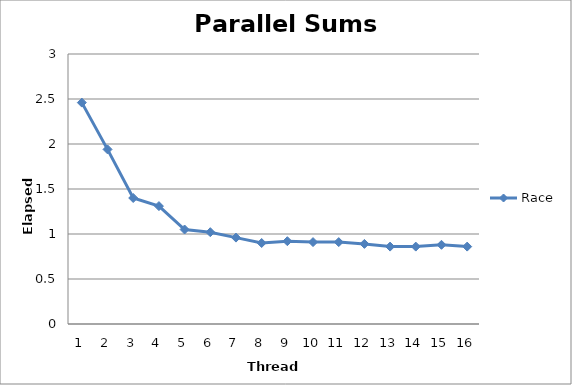
| Category | Race |
|---|---|
| 0 | 2.46 |
| 1 | 1.94 |
| 2 | 1.4 |
| 3 | 1.31 |
| 4 | 1.05 |
| 5 | 1.02 |
| 6 | 0.96 |
| 7 | 0.9 |
| 8 | 0.92 |
| 9 | 0.91 |
| 10 | 0.91 |
| 11 | 0.89 |
| 12 | 0.86 |
| 13 | 0.86 |
| 14 | 0.88 |
| 15 | 0.86 |